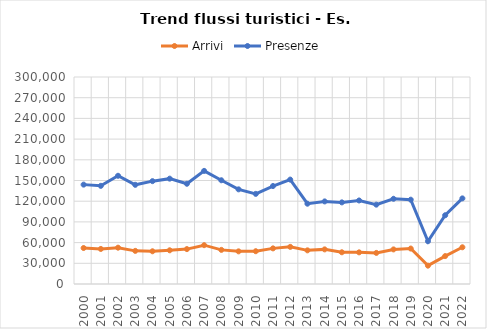
| Category | Arrivi | Presenze |
|---|---|---|
| 2000.0 | 52149 | 144018 |
| 2001.0 | 50796 | 142255 |
| 2002.0 | 52637 | 156855 |
| 2003.0 | 48016 | 143746 |
| 2004.0 | 47410 | 149052 |
| 2005.0 | 48847 | 152685 |
| 2006.0 | 50582 | 145277 |
| 2007.0 | 56267 | 163913 |
| 2008.0 | 49461 | 150340 |
| 2009.0 | 47301 | 137173 |
| 2010.0 | 47514 | 130623 |
| 2011.0 | 51627 | 142012 |
| 2012.0 | 53805 | 151331 |
| 2013.0 | 48768 | 116369 |
| 2014.0 | 50173 | 119683 |
| 2015.0 | 45975 | 118297 |
| 2016.0 | 45872 | 121063 |
| 2017.0 | 45058 | 114996 |
| 2018.0 | 50135 | 123494 |
| 2019.0 | 51383 | 122199 |
| 2020.0 | 26576 | 61967 |
| 2021.0 | 40475 | 99637 |
| 2022.0 | 53216 | 124077 |